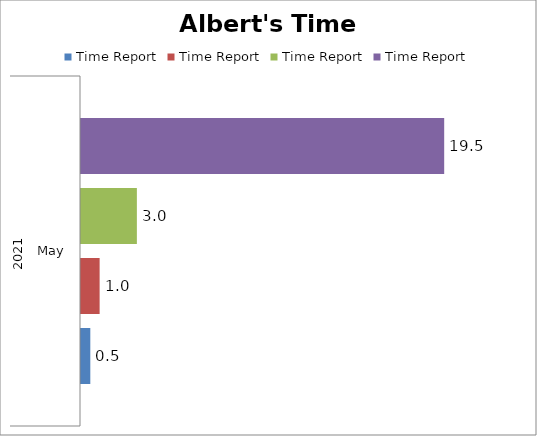
| Category | New category | Customer service | Self-care | (blank) |
|---|---|---|---|---|
| 0 | 0.5 | 1 | 3 | 19.5 |